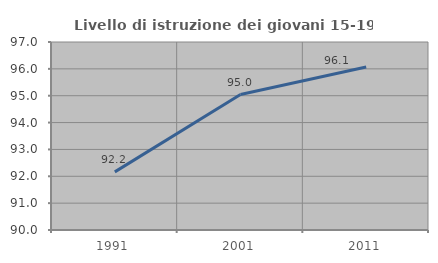
| Category | Livello di istruzione dei giovani 15-19 anni |
|---|---|
| 1991.0 | 92.164 |
| 2001.0 | 95.045 |
| 2011.0 | 96.067 |